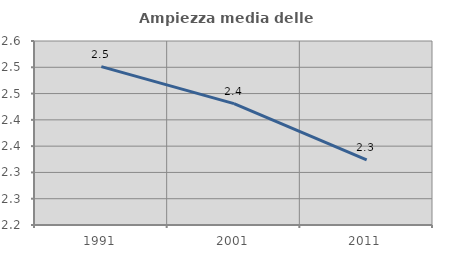
| Category | Ampiezza media delle famiglie |
|---|---|
| 1991.0 | 2.501 |
| 2001.0 | 2.431 |
| 2011.0 | 2.324 |